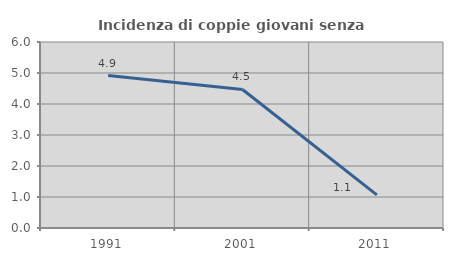
| Category | Incidenza di coppie giovani senza figli |
|---|---|
| 1991.0 | 4.918 |
| 2001.0 | 4.469 |
| 2011.0 | 1.07 |